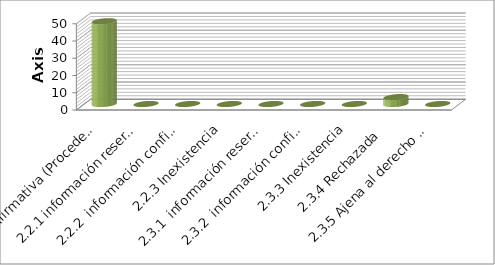
| Category | Series 0 |
|---|---|
| 2.1 Afirmativa (Procedente) | 48 |
| 2.2.1 información reservada | 0 |
| 2.2.2  información confidencial | 0 |
| 2.2.3 Inexistencia | 0 |
| 2.3.1  información reservada | 0 |
| 2.3.2  información confidencial | 0 |
| 2.3.3 Inexistencia | 0 |
| 2.3.4 Rechazada  | 4 |
| 2.3.5 Ajena al derecho de Inf. | 0 |